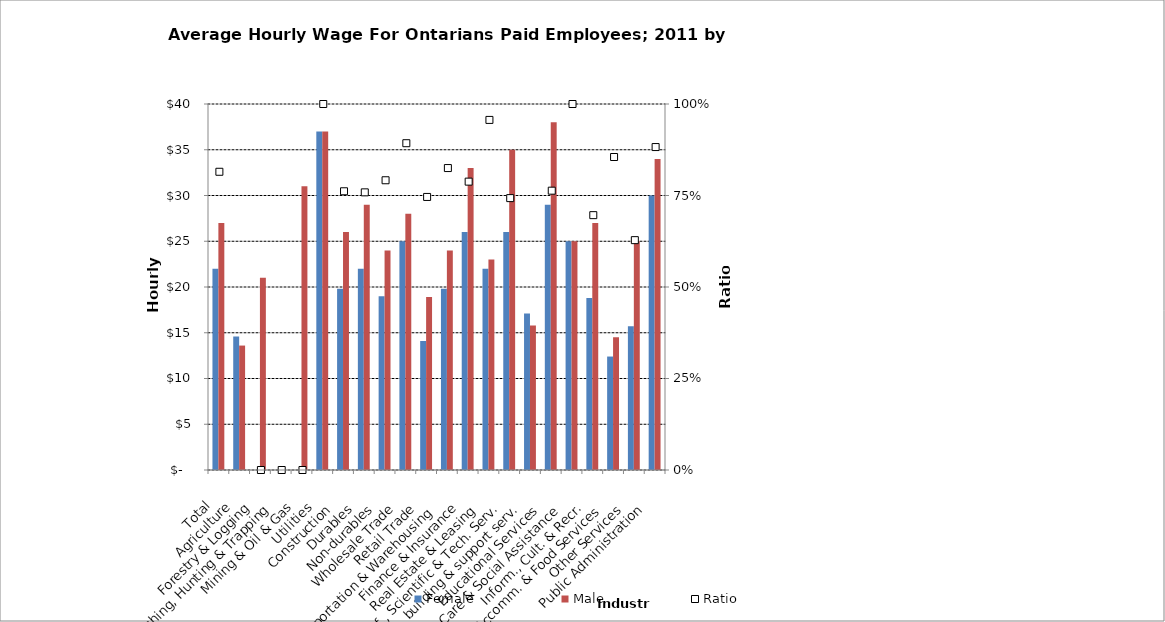
| Category | Female | Male |
|---|---|---|
| Total | 22 | 27 |
|  Agriculture   | 14.6 | 13.6 |
|  Forestry & Logging  | 0 | 21 |
|  Fishing, Hunting & Trapping   | 0 | 0 |
|  Mining & Oil & Gas  | 0 | 31 |
|  Utilities   | 37 | 37 |
|  Construction   | 19.8 | 26 |
|  Durables   | 22 | 29 |
|  Non-durables   | 19 | 24 |
|  Wholesale Trade   | 25 | 28 |
|  Retail Trade   | 14.1 | 18.9 |
|  Transportation & Warehousing   | 19.8 | 24 |
|  Finance & Insurance   | 26 | 33 |
|  Real Estate & Leasing   | 22 | 23 |
|  Prof., Scientific & Tech. Serv.  | 26 | 35 |
|  Bus., building & support serv.  | 17.1 | 15.8 |
|  Educational Services   | 29 | 38 |
|  Health Care & Social Assistance   | 25 | 25 |
|  Inform., Cult. & Recr.  | 18.8 | 27 |
|  Accomm. & Food Services   | 12.4 | 14.5 |
|  Other Services   | 15.7 | 25 |
|  Public Administration   | 30 | 34 |